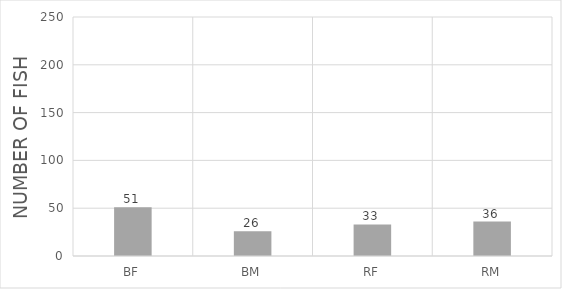
| Category | Count |
|---|---|
| BF | 51 |
| BM | 26 |
| RF | 33 |
| RM | 36 |